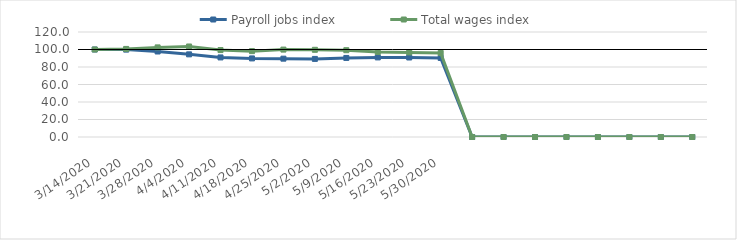
| Category | Payroll jobs index | Total wages index |
|---|---|---|
| 14/03/2020 | 100 | 100 |
| 21/03/2020 | 99.871 | 100.651 |
| 28/03/2020 | 97.706 | 102.42 |
| 04/04/2020 | 94.457 | 103.453 |
| 11/04/2020 | 90.946 | 99.334 |
| 18/04/2020 | 89.817 | 98.118 |
| 25/04/2020 | 89.535 | 99.885 |
| 02/05/2020 | 89.241 | 99.65 |
| 09/05/2020 | 90.354 | 99.199 |
| 16/05/2020 | 90.96 | 97.069 |
| 23/05/2020 | 90.858 | 96.63 |
| 30/05/2020 | 90.337 | 96.041 |